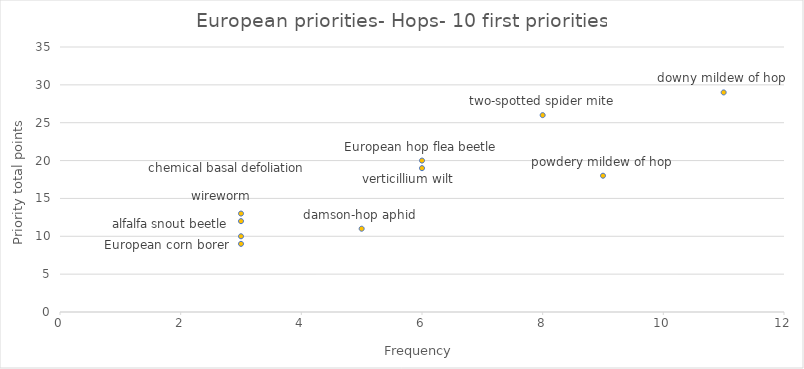
| Category | Priority total points |
|---|---|
| 11.0 | 29 |
| 8.0 | 26 |
| 6.0 | 20 |
| 6.0 | 19 |
| 9.0 | 18 |
| 3.0 | 13 |
| 3.0 | 12 |
| 5.0 | 11 |
| 3.0 | 10 |
| 3.0 | 9 |